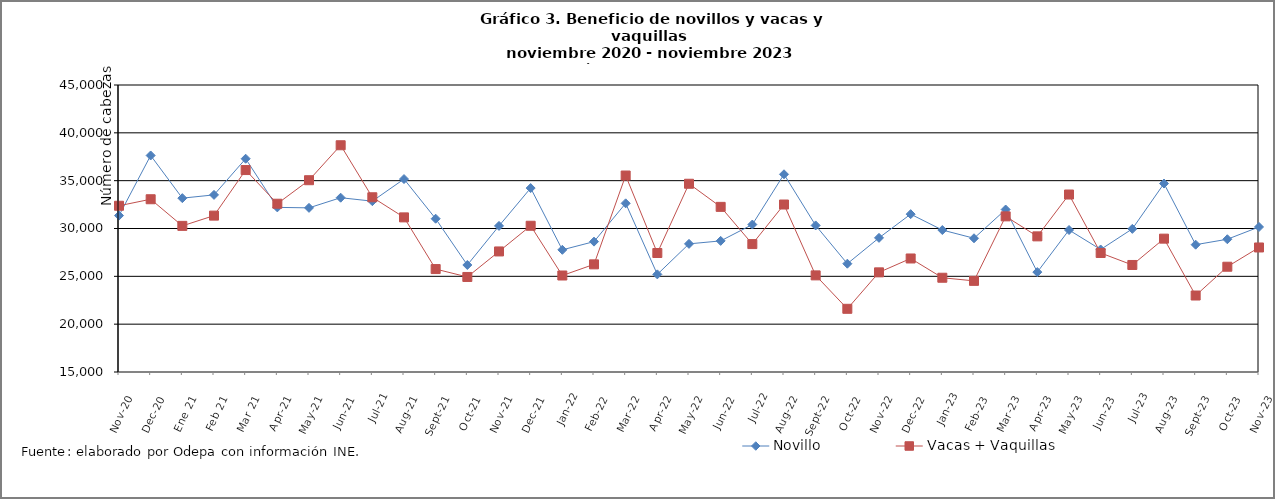
| Category | Novillo | Vacas + Vaquillas |
|---|---|---|
| nov-20 | 31351 | 32378 |
| dic-20 | 37633 | 33058 |
| Ene 21 | 33172 | 30276 |
| Feb 21 | 33514 | 31346 |
| Mar 21 | 37293 | 36109 |
| abr-21 | 32207 | 32590 |
| may-21 | 32159 | 35048 |
| jun-21 | 33219 | 38702 |
| jul-21 | 32857 | 33264 |
| ago-21 | 35169 | 31162 |
| sept-21 | 31024 | 25759 |
| oct-21 | 26185 | 24935 |
| nov-21 | 30271 | 27601 |
| dic-21 | 34226 | 30287 |
| ene-22 | 27772 | 25087 |
| feb-22 | 28627 | 26252 |
| mar-22 | 32630 | 35537 |
| abr-22 | 25206 | 27439 |
| may-22 | 28393 | 34677 |
| jun-22 | 28704 | 32262 |
| jul-22 | 30413 | 28370 |
| ago-22 | 35669 | 32506 |
| sept-22 | 30321 | 25099 |
| oct-22 | 26321 | 21605 |
| nov-22 | 29022 | 25417 |
| dic-22 | 31499 | 26867 |
| ene-23 | 29839 | 24852 |
| feb-23 | 28980 | 24526 |
| mar-23 | 31983 | 31270 |
| abr-23 | 25443 | 29177 |
| may-23 | 29843 | 33552 |
| jun-23 | 27806 | 27442 |
| jul-23 | 29961 | 26187 |
| ago-23 | 34699 | 28940 |
| sept-23 | 28308 | 22994 |
| oct-23 | 28877 | 26004 |
| nov-23 | 30160 | 28016 |